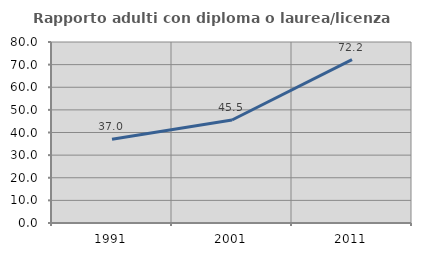
| Category | Rapporto adulti con diploma o laurea/licenza media  |
|---|---|
| 1991.0 | 37.037 |
| 2001.0 | 45.531 |
| 2011.0 | 72.198 |